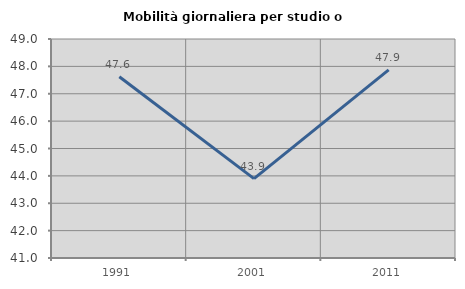
| Category | Mobilità giornaliera per studio o lavoro |
|---|---|
| 1991.0 | 47.622 |
| 2001.0 | 43.899 |
| 2011.0 | 47.87 |